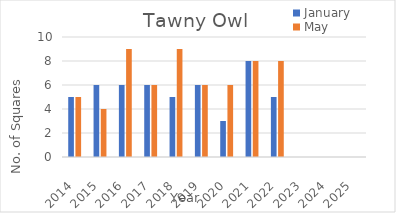
| Category | January | May |
|---|---|---|
| 2014.0 | 5 | 5 |
| 2015.0 | 6 | 4 |
| 2016.0 | 6 | 9 |
| 2017.0 | 6 | 6 |
| 2018.0 | 5 | 9 |
| 2019.0 | 6 | 6 |
| 2020.0 | 3 | 6 |
| 2021.0 | 8 | 8 |
| 2022.0 | 5 | 8 |
| 2023.0 | 0 | 0 |
| 2024.0 | 0 | 0 |
| 2025.0 | 0 | 0 |